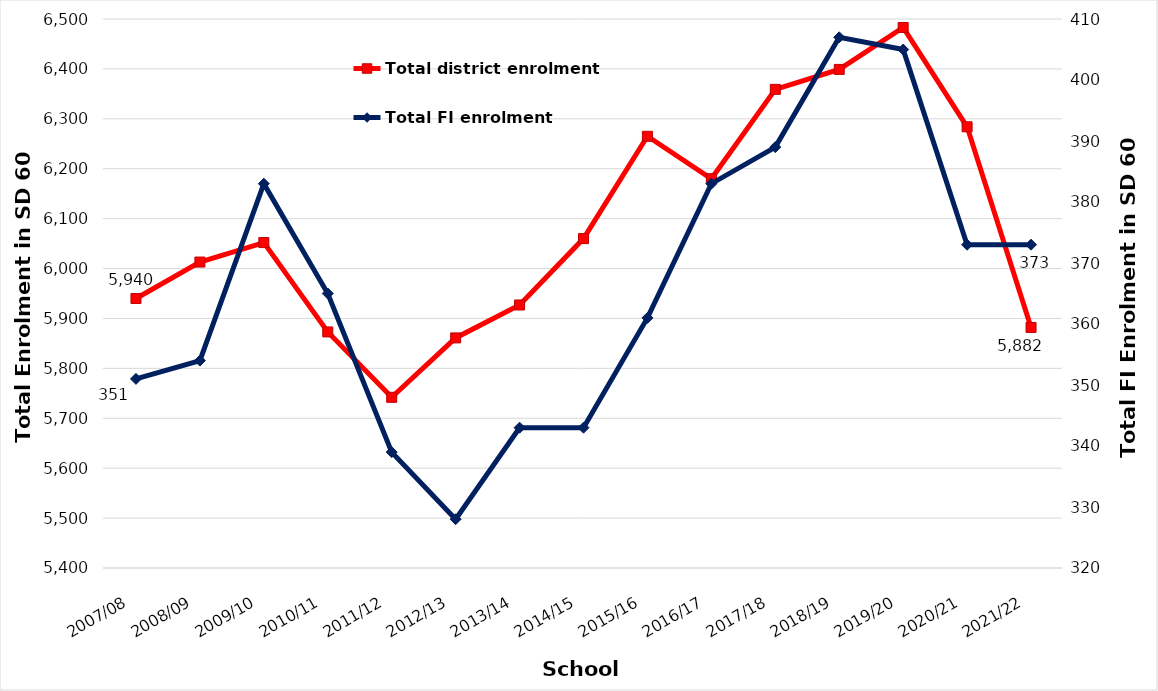
| Category | Total district enrolment  |
|---|---|
| 2007/08 | 5940 |
| 2008/09 | 6013 |
| 2009/10 | 6052 |
| 2010/11 | 5873 |
| 2011/12 | 5742 |
| 2012/13 | 5861 |
| 2013/14 | 5927 |
| 2014/15 | 6060 |
| 2015/16 | 6265 |
| 2016/17 | 6180 |
| 2017/18 | 6359 |
| 2018/19 | 6399 |
| 2019/20 | 6483 |
| 2020/21 | 6284 |
| 2021/22 | 5882 |